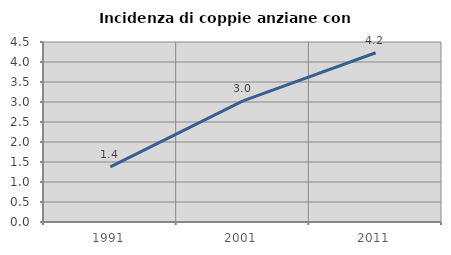
| Category | Incidenza di coppie anziane con figli |
|---|---|
| 1991.0 | 1.379 |
| 2001.0 | 3.028 |
| 2011.0 | 4.232 |